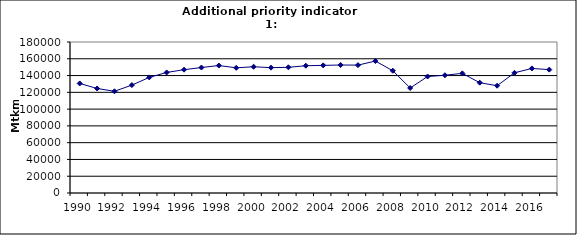
| Category | Freight transport on road, Mtkm |
|---|---|
| 1990 | 130600 |
| 1991 | 124592 |
| 1992 | 121250 |
| 1993 | 128625 |
| 1994 | 137811 |
| 1995 | 143700 |
| 1996 | 147000 |
| 1997 | 149557 |
| 1998 | 151931 |
| 1999 | 149225 |
| 2000 | 150482 |
| 2001 | 149398 |
| 2002 | 149826 |
| 2003 | 151711 |
| 2004 | 152126 |
| 2005 | 152566 |
| 2006 | 152445 |
| 2007 | 157311 |
| 2008 | 145760 |
| 2009 | 125177 |
| 2010 | 138850 |
| 2011 | 140366 |
| 2012 | 142625 |
| 2013 | 131493 |
| 2014 | 127885 |
| 2015 | 143294 |
| 2016 | 148494 |
| 2017 | 147049.432 |